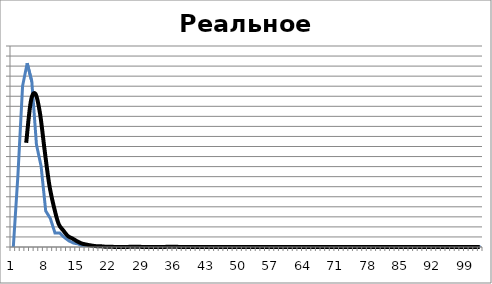
| Category | Реальное распределение |
|---|---|
| 0 | 0 |
| 1 | 164 |
| 2 | 366 |
| 3 | 418 |
| 4 | 376 |
| 5 | 233 |
| 6 | 184 |
| 7 | 82 |
| 8 | 65 |
| 9 | 32 |
| 10 | 32 |
| 11 | 22 |
| 12 | 14 |
| 13 | 9 |
| 14 | 7 |
| 15 | 2 |
| 16 | 4 |
| 17 | 1 |
| 18 | 1 |
| 19 | 1 |
| 20 | 0 |
| 21 | 0 |
| 22 | 0 |
| 23 | 0 |
| 24 | 1 |
| 25 | 0 |
| 26 | 1 |
| 27 | 0 |
| 28 | 0 |
| 29 | 0 |
| 30 | 0 |
| 31 | 0 |
| 32 | 1 |
| 33 | 0 |
| 34 | 1 |
| 35 | 0 |
| 36 | 0 |
| 37 | 0 |
| 38 | 0 |
| 39 | 0 |
| 40 | 0 |
| 41 | 0 |
| 42 | 0 |
| 43 | 0 |
| 44 | 0 |
| 45 | 0 |
| 46 | 0 |
| 47 | 0 |
| 48 | 0 |
| 49 | 0 |
| 50 | 0 |
| 51 | 0 |
| 52 | 0 |
| 53 | 0 |
| 54 | 0 |
| 55 | 0 |
| 56 | 0 |
| 57 | 0 |
| 58 | 0 |
| 59 | 0 |
| 60 | 0 |
| 61 | 0 |
| 62 | 0 |
| 63 | 0 |
| 64 | 0 |
| 65 | 0 |
| 66 | 0 |
| 67 | 0 |
| 68 | 0 |
| 69 | 0 |
| 70 | 0 |
| 71 | 0 |
| 72 | 0 |
| 73 | 0 |
| 74 | 0 |
| 75 | 0 |
| 76 | 0 |
| 77 | 0 |
| 78 | 0 |
| 79 | 0 |
| 80 | 0 |
| 81 | 0 |
| 82 | 0 |
| 83 | 0 |
| 84 | 0 |
| 85 | 0 |
| 86 | 0 |
| 87 | 0 |
| 88 | 0 |
| 89 | 0 |
| 90 | 0 |
| 91 | 0 |
| 92 | 0 |
| 93 | 0 |
| 94 | 0 |
| 95 | 0 |
| 96 | 0 |
| 97 | 0 |
| 98 | 0 |
| 99 | 0 |
| 100 | 0 |
| 101 | 0 |